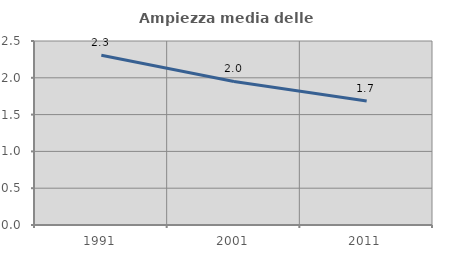
| Category | Ampiezza media delle famiglie |
|---|---|
| 1991.0 | 2.306 |
| 2001.0 | 1.951 |
| 2011.0 | 1.685 |